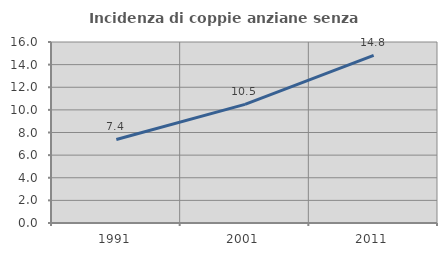
| Category | Incidenza di coppie anziane senza figli  |
|---|---|
| 1991.0 | 7.386 |
| 2001.0 | 10.488 |
| 2011.0 | 14.815 |